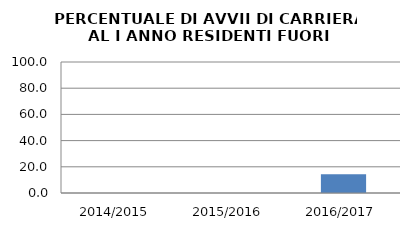
| Category | 2014/2015 2015/2016 2016/2017 |
|---|---|
| 2014/2015 | 0 |
| 2015/2016 | 0 |
| 2016/2017 | 14.286 |